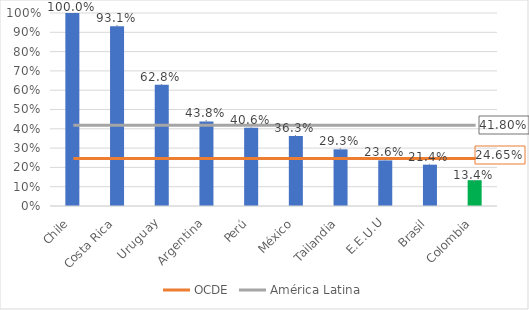
| Category | % finanzas alternativas a empresas |
|---|---|
| Chile | 1 |
| Costa Rica | 0.931 |
| Uruguay | 0.628 |
| Argentina | 0.438 |
| Perú | 0.406 |
| México | 0.363 |
| Tailandia | 0.293 |
| E.E.U.U | 0.236 |
| Brasil | 0.214 |
| Colombia | 0.134 |